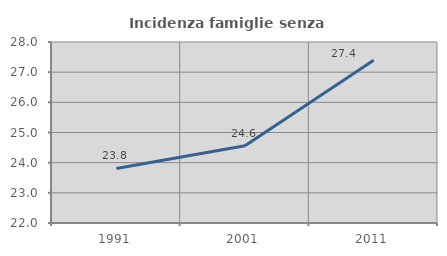
| Category | Incidenza famiglie senza nuclei |
|---|---|
| 1991.0 | 23.81 |
| 2001.0 | 24.558 |
| 2011.0 | 27.397 |